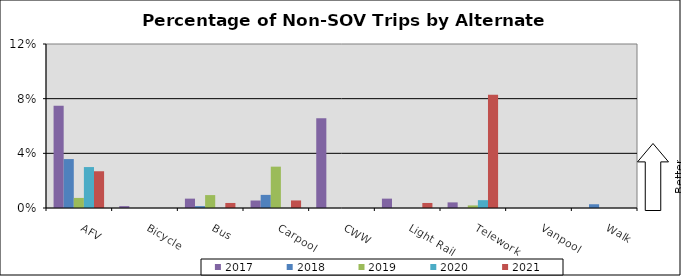
| Category | 2017 | 2018 | 2019 | 2020 | 2021 |
|---|---|---|---|---|---|
| AFV | 0.075 | 0.036 | 0.007 | 0.03 | 0.027 |
| Bicycle | 0.001 | 0 | 0 | 0 | 0 |
| Bus | 0.007 | 0.001 | 0.009 | 0 | 0.004 |
| Carpool | 0.005 | 0.01 | 0.03 | 0 | 0.006 |
| CWW | 0.066 | 0 | 0 | 0 | 0 |
| Light Rail | 0.007 | 0 | 0 | 0 | 0.004 |
| Telework | 0.004 | 0 | 0.002 | 0.006 | 0.083 |
| Vanpool | 0 | 0 | 0 | 0 | 0 |
| Walk | 0 | 0.003 | 0 | 0 | 0 |